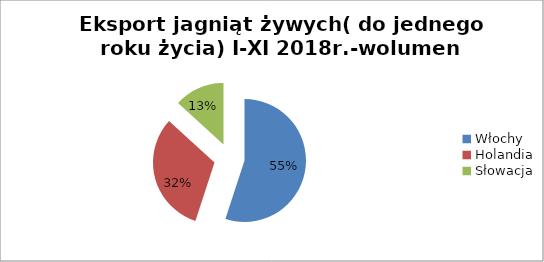
| Category | Wolumen (tony) |
|---|---|
| Włochy | 374.252 |
| Holandia | 215.742 |
| Słowacja | 90.133 |